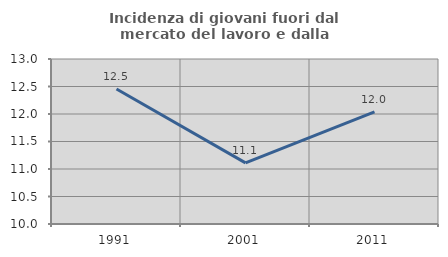
| Category | Incidenza di giovani fuori dal mercato del lavoro e dalla formazione  |
|---|---|
| 1991.0 | 12.454 |
| 2001.0 | 11.111 |
| 2011.0 | 12.037 |